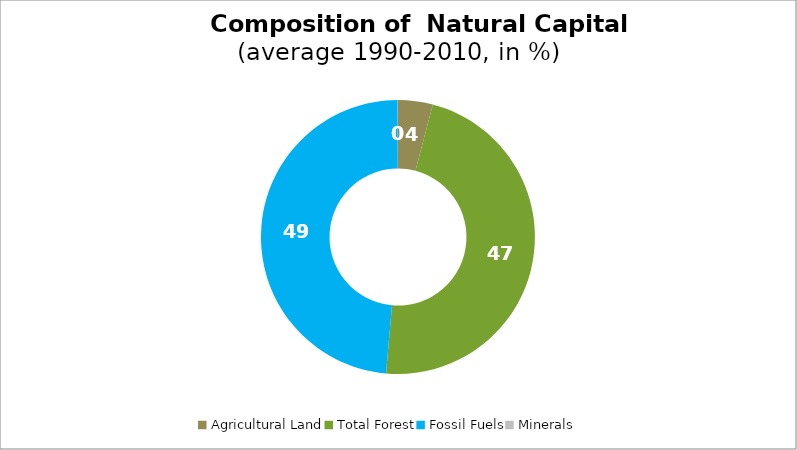
| Category | Series 0 |
|---|---|
| Agricultural Land | 4.091 |
| Total Forest | 47.305 |
| Fossil Fuels | 48.569 |
| Minerals | 0.035 |